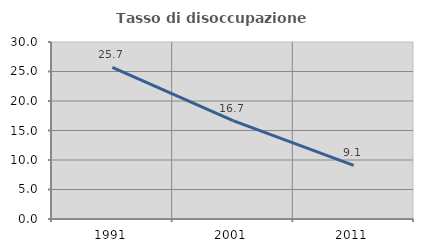
| Category | Tasso di disoccupazione giovanile  |
|---|---|
| 1991.0 | 25.714 |
| 2001.0 | 16.667 |
| 2011.0 | 9.091 |